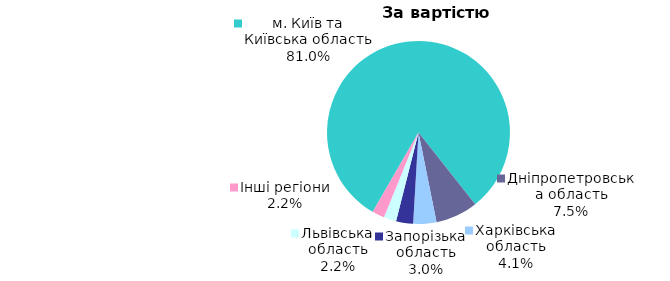
| Category | Series 0 |
|---|---|
| м. Київ та Київська область | 0.81 |
| Дніпропетровська область | 0.075 |
| Харківська область | 0.041 |
| Запорізька область | 0.03 |
| Львівська область | 0.022 |
| Інші регіони | 0.022 |